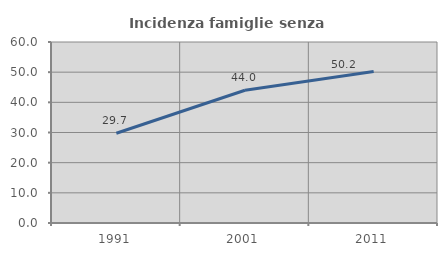
| Category | Incidenza famiglie senza nuclei |
|---|---|
| 1991.0 | 29.749 |
| 2001.0 | 44.014 |
| 2011.0 | 50.193 |